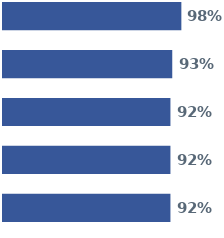
| Category | Series 0 | Series 1 | Series 2 | Series 3 | Series 4 |
|---|---|---|---|---|---|
| 0 | 0.98 | 0.93 | 0.92 | 0.92 | 0.92 |